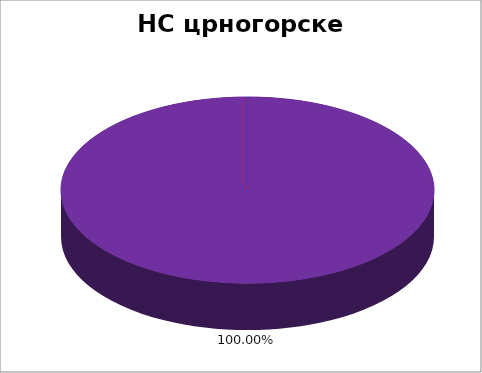
| Category | НС црногорске НМ |
|---|---|
| 0 | 0 |
| 1 | 0 |
| 2 | 0 |
| 3 | 0 |
| 4 | 1 |